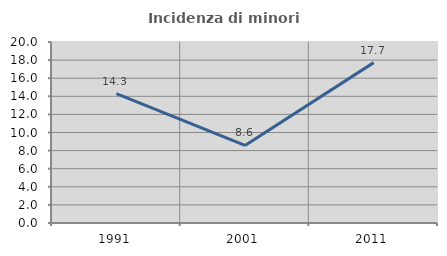
| Category | Incidenza di minori stranieri |
|---|---|
| 1991.0 | 14.286 |
| 2001.0 | 8.571 |
| 2011.0 | 17.722 |